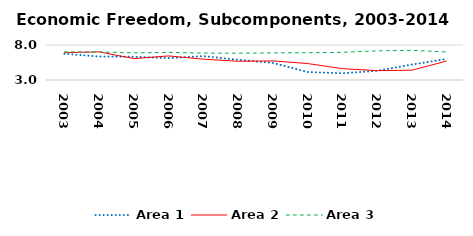
| Category | Area 1 | Area 2 | Area 3 |
|---|---|---|---|
| 2003.0 | 6.745 | 6.904 | 7.012 |
| 2004.0 | 6.358 | 7.021 | 7.007 |
| 2005.0 | 6.319 | 6.054 | 6.885 |
| 2006.0 | 6.129 | 6.441 | 6.944 |
| 2007.0 | 6.413 | 5.976 | 6.844 |
| 2008.0 | 5.886 | 5.679 | 6.823 |
| 2009.0 | 5.444 | 5.728 | 6.876 |
| 2010.0 | 4.136 | 5.35 | 6.902 |
| 2011.0 | 3.957 | 4.621 | 6.948 |
| 2012.0 | 4.319 | 4.336 | 7.162 |
| 2013.0 | 5.203 | 4.401 | 7.24 |
| 2014.0 | 6.003 | 5.708 | 7.008 |